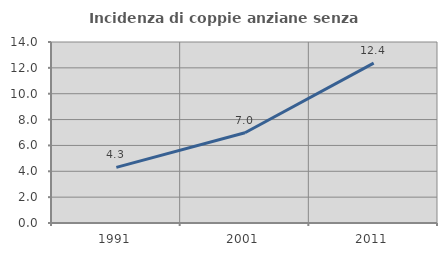
| Category | Incidenza di coppie anziane senza figli  |
|---|---|
| 1991.0 | 4.3 |
| 2001.0 | 6.984 |
| 2011.0 | 12.367 |